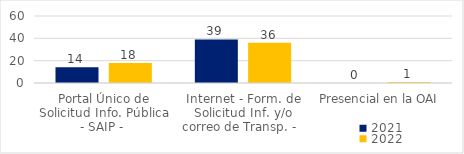
| Category | 2021 | 2022 |
|---|---|---|
| Portal Único de Solicitud Info. Pública - SAIP -  | 14 | 18 |
| Internet - Form. de Solicitud Inf. y/o correo de Transp. -   | 39 | 36 |
| Presencial en la OAI  | 0 | 1 |